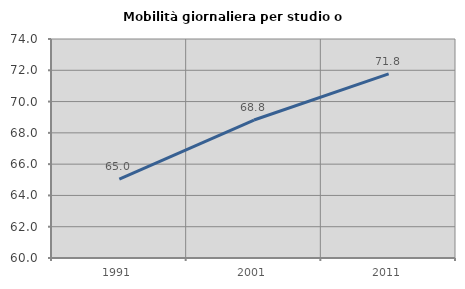
| Category | Mobilità giornaliera per studio o lavoro |
|---|---|
| 1991.0 | 65.041 |
| 2001.0 | 68.821 |
| 2011.0 | 71.769 |